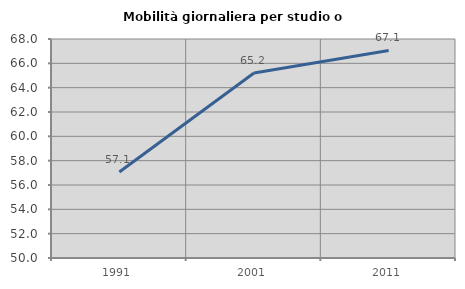
| Category | Mobilità giornaliera per studio o lavoro |
|---|---|
| 1991.0 | 57.062 |
| 2001.0 | 65.206 |
| 2011.0 | 67.063 |